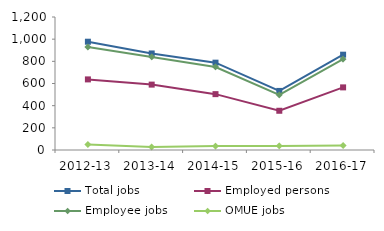
| Category | Total jobs | Employed persons | Employee jobs | OMUE jobs |
|---|---|---|---|---|
| 2012-13 | 977 | 637 | 930 | 49 |
| 2013-14 | 871 | 590 | 840 | 27 |
| 2014-15 | 788 | 504 | 749 | 36 |
| 2015-16 | 533 | 354 | 498 | 37 |
| 2016-17 | 860 | 565 | 820 | 40 |